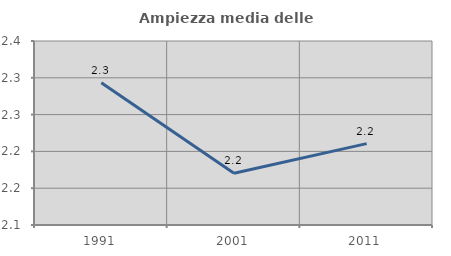
| Category | Ampiezza media delle famiglie |
|---|---|
| 1991.0 | 2.293 |
| 2001.0 | 2.17 |
| 2011.0 | 2.211 |